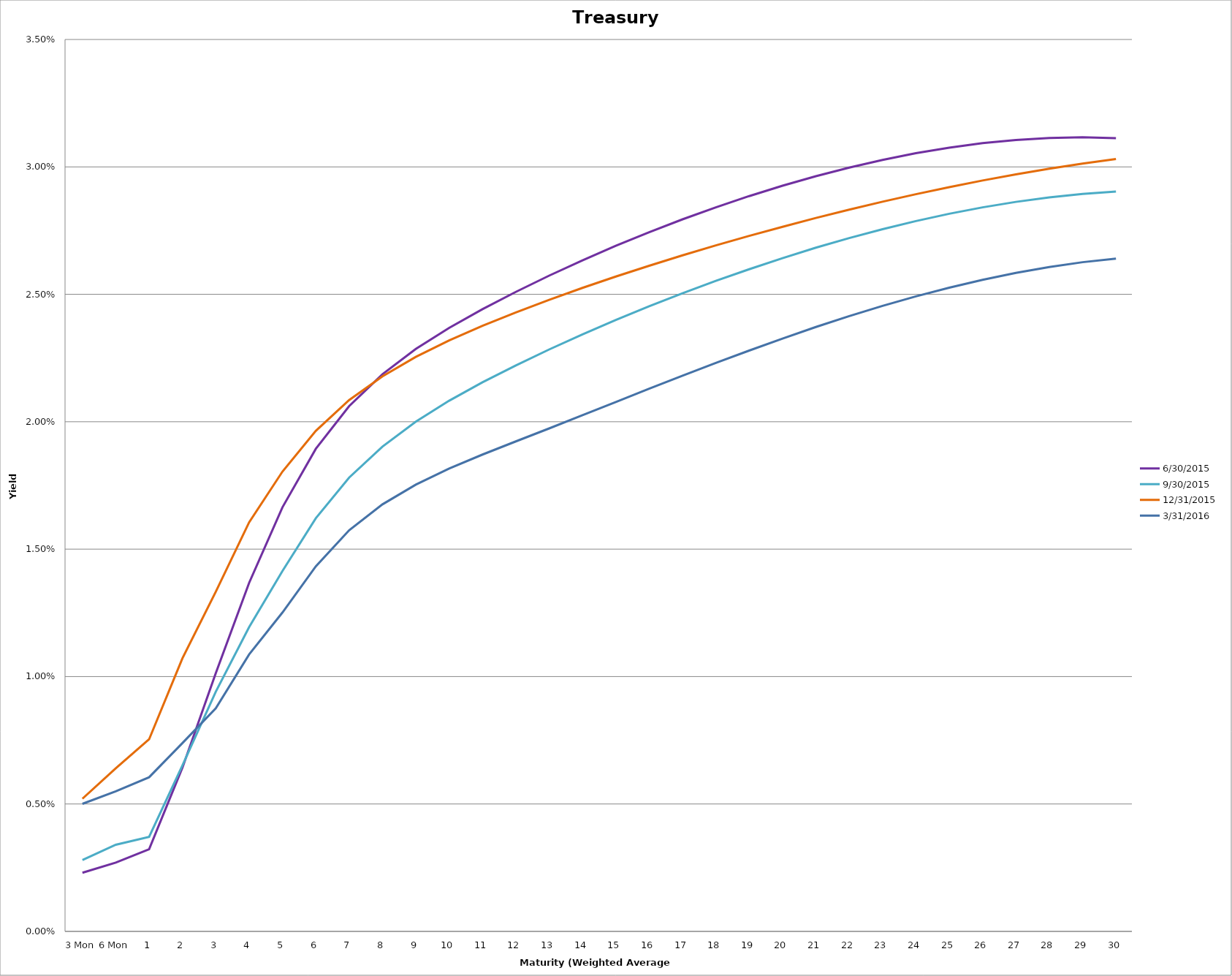
| Category | 6/30/2015 | 9/30/2015 | 12/31/2015 | 3/31/2016 |
|---|---|---|---|---|
| 3 Mon | 0.002 | 0.003 | 0.005 | 0.005 |
| 6 Mon | 0.003 | 0.003 | 0.006 | 0.006 |
| 1 | 0.003 | 0.004 | 0.008 | 0.006 |
| 2 | 0.006 | 0.007 | 0.011 | 0.007 |
| 3 | 0.01 | 0.009 | 0.013 | 0.009 |
| 4 | 0.014 | 0.012 | 0.016 | 0.011 |
| 5 | 0.017 | 0.014 | 0.018 | 0.013 |
| 6 | 0.019 | 0.016 | 0.02 | 0.014 |
| 7 | 0.021 | 0.018 | 0.021 | 0.016 |
| 8 | 0.022 | 0.019 | 0.022 | 0.017 |
| 9 | 0.023 | 0.02 | 0.023 | 0.018 |
| 10 | 0.024 | 0.021 | 0.023 | 0.018 |
| 11 | 0.024 | 0.022 | 0.024 | 0.019 |
| 12 | 0.025 | 0.022 | 0.024 | 0.019 |
| 13 | 0.026 | 0.023 | 0.025 | 0.02 |
| 14 | 0.026 | 0.023 | 0.025 | 0.02 |
| 15 | 0.027 | 0.024 | 0.026 | 0.021 |
| 16 | 0.027 | 0.025 | 0.026 | 0.021 |
| 17 | 0.028 | 0.025 | 0.027 | 0.022 |
| 18 | 0.028 | 0.026 | 0.027 | 0.022 |
| 19 | 0.029 | 0.026 | 0.027 | 0.023 |
| 20 | 0.029 | 0.026 | 0.028 | 0.023 |
| 21 | 0.03 | 0.027 | 0.028 | 0.024 |
| 22 | 0.03 | 0.027 | 0.028 | 0.024 |
| 23 | 0.03 | 0.028 | 0.029 | 0.025 |
| 24 | 0.031 | 0.028 | 0.029 | 0.025 |
| 25 | 0.031 | 0.028 | 0.029 | 0.025 |
| 26 | 0.031 | 0.028 | 0.029 | 0.026 |
| 27 | 0.031 | 0.029 | 0.03 | 0.026 |
| 28 | 0.031 | 0.029 | 0.03 | 0.026 |
| 29 | 0.031 | 0.029 | 0.03 | 0.026 |
| 30 | 0.031 | 0.029 | 0.03 | 0.026 |